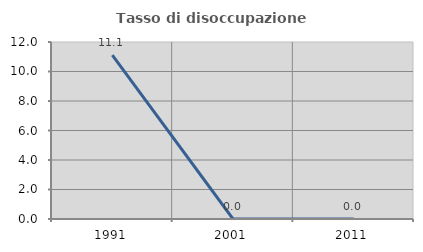
| Category | Tasso di disoccupazione giovanile  |
|---|---|
| 1991.0 | 11.111 |
| 2001.0 | 0 |
| 2011.0 | 0 |